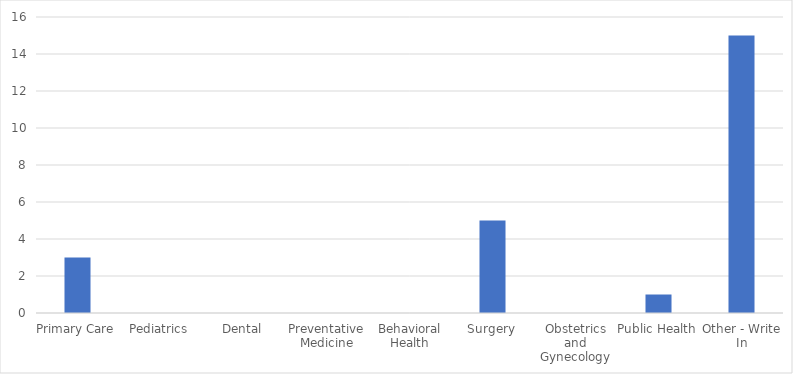
| Category | Number of Responses |
|---|---|
| Primary Care | 3 |
| Pediatrics | 0 |
| Dental | 0 |
| Preventative Medicine | 0 |
| Behavioral Health | 0 |
| Surgery | 5 |
| Obstetrics and Gynecology | 0 |
| Public Health | 1 |
| Other - Write In | 15 |